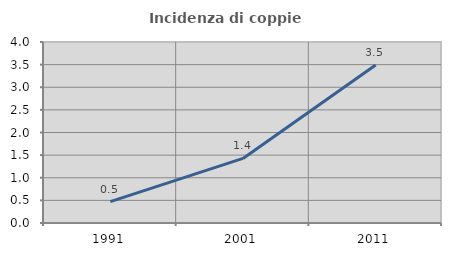
| Category | Incidenza di coppie miste |
|---|---|
| 1991.0 | 0.473 |
| 2001.0 | 1.427 |
| 2011.0 | 3.491 |